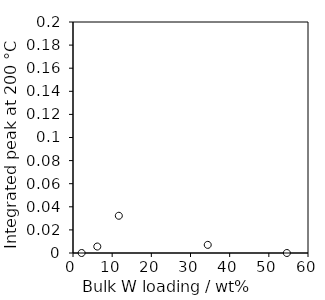
| Category | 200 C |
|---|---|
| 2.2 | 0 |
| 6.2 | 0.006 |
| 11.7 | 0.032 |
| 34.4 | 0.007 |
| 54.6 | 0 |